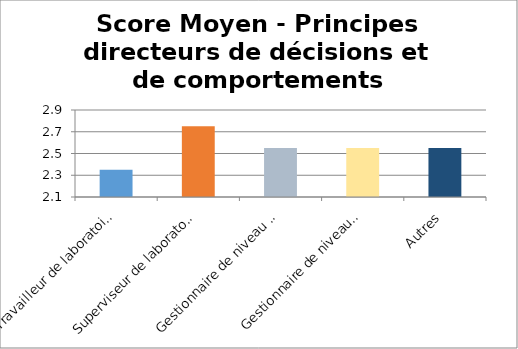
| Category | Score Moyen pour Principes directeurs de décisions et de comportements |
|---|---|
| Travailleur de laboratoire | 2.35 |
| Superviseur de laboratoire | 2.75 |
| Gestionnaire de niveau intermédiaire | 2.55 |
| Gestionnaire de niveausupérieur | 2.55 |
| Autres | 2.55 |